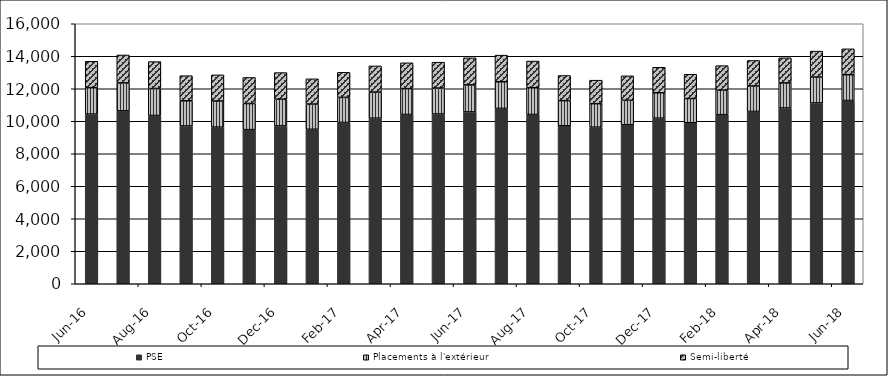
| Category | PSE | Placements à l'extérieur | Semi-liberté |
|---|---|---|---|
| 2016-06-01 | 10441 | 1625 | 1625 |
| 2016-07-01 | 10642 | 1718 | 1718 |
| 2016-08-01 | 10355 | 1658 | 1658 |
| 2016-09-01 | 9712 | 1546 | 1546 |
| 2016-10-01 | 9640 | 1607 | 1607 |
| 2016-11-01 | 9484 | 1605 | 1605 |
| 2016-12-01 | 9714 | 1641 | 1641 |
| 2017-01-01 | 9505 | 1553 | 1553 |
| 2017-02-01 | 9927 | 1542 | 1542 |
| 2017-03-01 | 10190 | 1607 | 1607 |
| 2017-04-01 | 10417 | 1590 | 1590 |
| 2017-05-01 | 10448 | 1594 | 1594 |
| 2017-06-01 | 10575 | 1664 | 1664 |
| 2017-07-01 | 10791 | 1639 | 1639 |
| 2017-08-01 | 10417 | 1644 | 1644 |
| 2017-09-01 | 9723 | 1547 | 1547 |
| 2017-10-01 | 9637 | 1445 | 1445 |
| 2017-11-01 | 9787 | 1504 | 1504 |
| 2017-12-01 | 10187 | 1568 | 1568 |
| 2018-01-01 | 9907 | 1493 | 1493 |
| 2018-02-01 | 10406 | 1508 | 1508 |
| 2018-03-01 | 10603 | 1569 | 1569 |
| 2018-04-01 | 10817 | 1544 | 1544 |
| 2018-05-01 | 11127 | 1594 | 1594 |
| 2018-06-01 | 11275 | 1591 | 1591 |